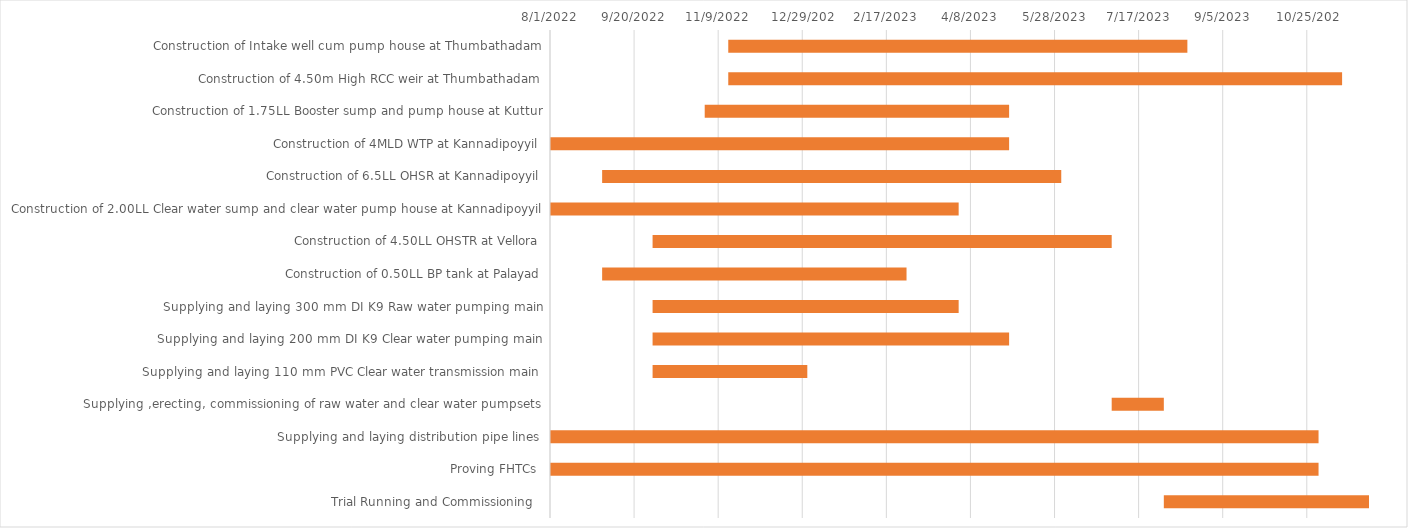
| Category | Start Date | 273 |
|---|---|---|
| Construction of Intake well cum pump house at Thumbathadam | 11/15/22 | 273 |
| Construction of 4.50m High RCC weir at Thumbathadam | 11/15/22 | 365 |
| Construction of 1.75LL Booster sump and pump house at Kuttur | 11/1/22 | 181 |
| Construction of 4MLD WTP at Kannadipoyyil | 8/1/22 | 273 |
| Construction of 6.5LL OHSR at Kannadipoyyil | 9/1/22 | 273 |
| Construction of 2.00LL Clear water sump and clear water pump house at Kannadipoyyil | 8/1/22 | 243 |
| Construction of 4.50LL OHSTR at Vellora | 10/1/22 | 273 |
| Construction of 0.50LL BP tank at Palayad | 9/1/22 | 181 |
| Supplying and laying 300 mm DI K9 Raw water pumping main | 10/1/22 | 182 |
| Supplying and laying 200 mm DI K9 Clear water pumping main | 10/1/22 | 212 |
| Supplying and laying 110 mm PVC Clear water transmission main | 10/1/22 | 92 |
| Supplying ,erecting, commissioning of raw water and clear water pumpsets | 7/1/23 | 31 |
| Supplying and laying distribution pipe lines | 8/1/22 | 457 |
| Proving FHTCs | 8/1/22 | 457 |
| Trial Running and Commissioning  | 8/1/23 | 122 |